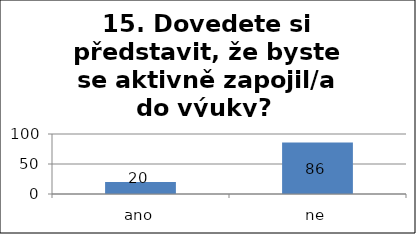
| Category | Series 0 |
|---|---|
| ano | 20 |
| ne | 86 |